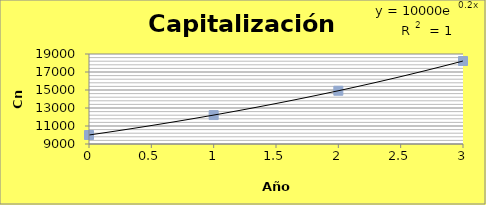
| Category | Capitalización Continua |
|---|---|
| 0.0 | 10000 |
| 1.0 | 12214.027 |
| 2.0 | 14918.245 |
| 3.0 | 18221.185 |